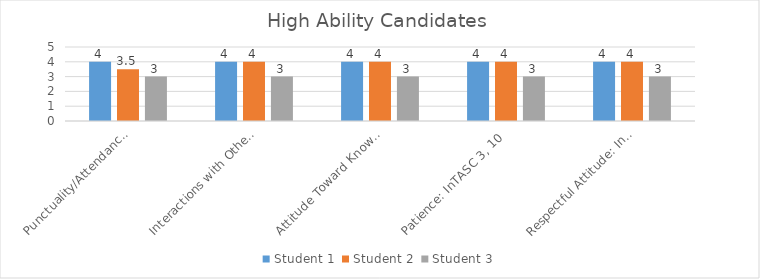
| Category | Student 1 | Student 2 | Student 3 |
|---|---|---|---|
| Punctuality/Attendance: InTASC 1, 9 | 4 | 3.5 | 3 |
| Interactions with Others: InTASC 3, 7, 10 | 4 | 4 | 3 |
| Attitude Toward Knowledge and Learning: InTASC 1, 4, 5, 9, 10 | 4 | 4 | 3 |
| Patience: InTASC 3, 10 | 4 | 4 | 3 |
| Respectful Attitude: InTASC 3, 7, 10 | 4 | 4 | 3 |